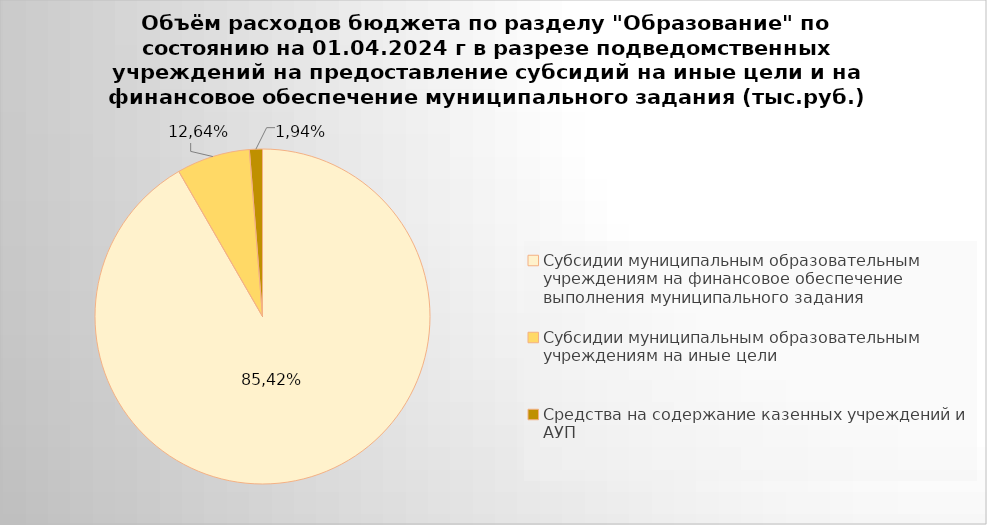
| Category | Series 0 |
|---|---|
| Субсидии муниципальным образовательным учреждениям на финансовое обеспечение выполнения муниципального задания | 9182006.14 |
| Субсидии муниципальным образовательным учреждениям на иные цели | 708763.02 |
| Средства на содержание казенных учреждений и АУП | 125516.68 |